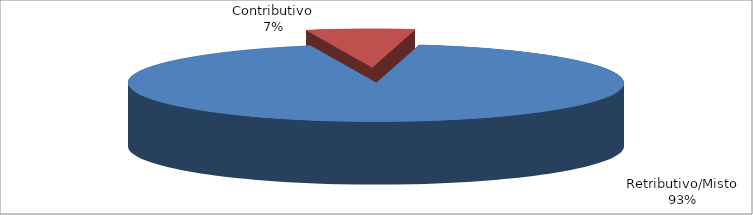
| Category | Decorrenti gennaio - settembre 2021 |
|---|---|
| Retributivo/Misto | 52588 |
| Contributivo | 3984 |